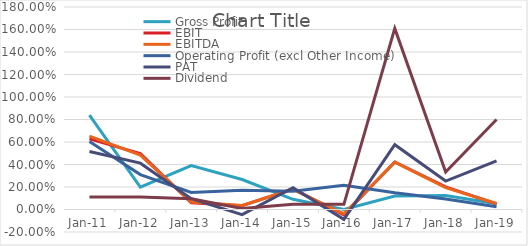
| Category | Gross Profit | EBIT | EBITDA | Operating Profit (excl Other Income) | PAT | Dividend |
|---|---|---|---|---|---|---|
| 2011-03-31 | 0.839 | 0.628 | 0.653 | 0.604 | 0.516 | 0.112 |
| 2012-03-31 | 0.199 | 0.497 | 0.483 | 0.31 | 0.412 | 0.11 |
| 2013-03-31 | 0.391 | 0.059 | 0.067 | 0.151 | 0.095 | 0.095 |
| 2014-03-31 | 0.266 | 0.034 | 0.036 | 0.172 | -0.046 | 0.01 |
| 2015-03-31 | 0.091 | 0.184 | 0.179 | 0.163 | 0.194 | 0.048 |
| 2016-03-31 | 0 | -0.049 | -0.039 | 0.215 | -0.088 | 0.046 |
| 2017-03-31 | 0.12 | 0.422 | 0.421 | 0.148 | 0.576 | 1.609 |
| 2018-03-31 | 0.125 | 0.201 | 0.194 | 0.094 | 0.253 | 0.334 |
| 2019-03-31 | 0.051 | 0.05 | 0.053 | 0.024 | 0.433 | 0.8 |